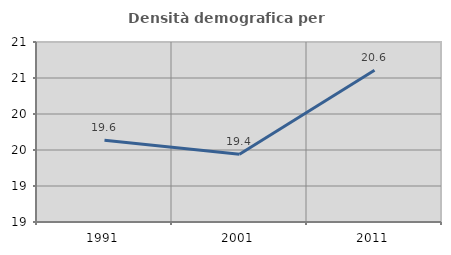
| Category | Densità demografica |
|---|---|
| 1991.0 | 19.637 |
| 2001.0 | 19.442 |
| 2011.0 | 20.609 |